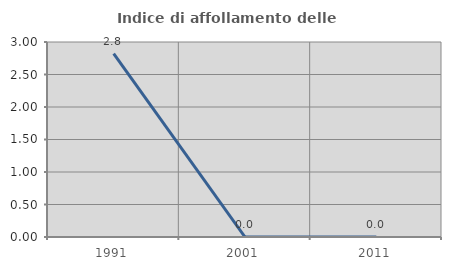
| Category | Indice di affollamento delle abitazioni  |
|---|---|
| 1991.0 | 2.821 |
| 2001.0 | 0 |
| 2011.0 | 0 |